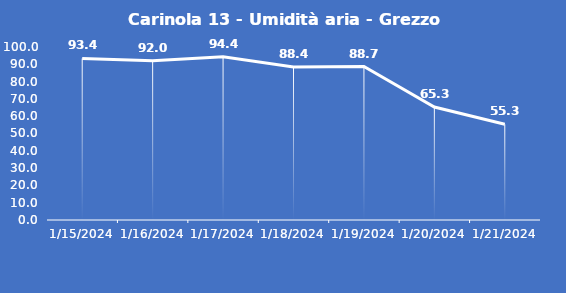
| Category | Carinola 13 - Umidità aria - Grezzo (%) |
|---|---|
| 1/15/24 | 93.4 |
| 1/16/24 | 92 |
| 1/17/24 | 94.4 |
| 1/18/24 | 88.4 |
| 1/19/24 | 88.7 |
| 1/20/24 | 65.3 |
| 1/21/24 | 55.3 |